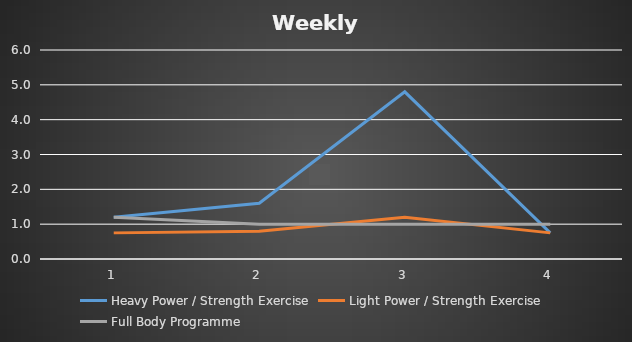
| Category | Heavy Power / Strength Exercise | Light Power / Strength Exercise | Full Body Programme |
|---|---|---|---|
| 0 | 1.2 | 0.75 | 1.2 |
| 1 | 1.6 | 0.8 | 1 |
| 2 | 4.8 | 1.2 | 1 |
| 3 | 0.75 | 0.75 | 1 |